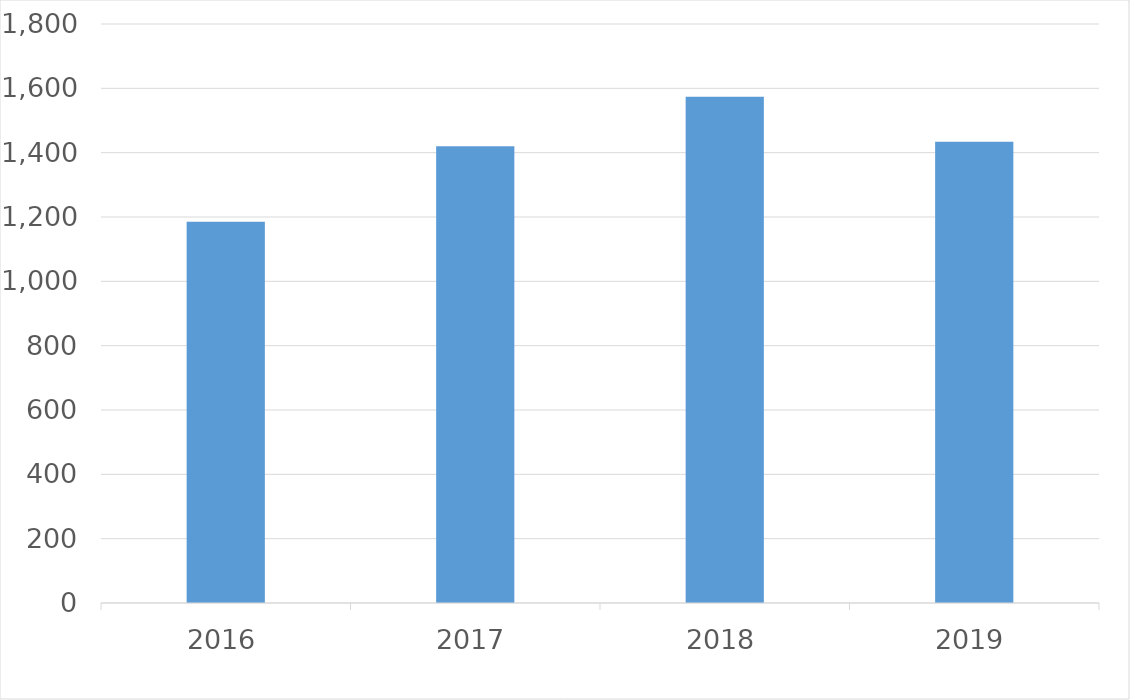
| Category | Series 0 |
|---|---|
| 2016 | 1185 |
| 2017 | 1420 |
| 2018 | 1574 |
| 2019 | 1434 |